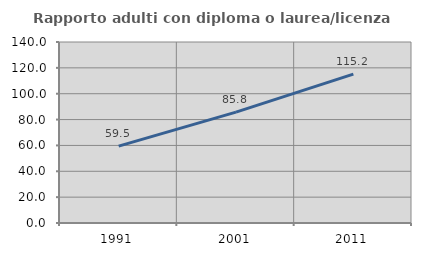
| Category | Rapporto adulti con diploma o laurea/licenza media  |
|---|---|
| 1991.0 | 59.496 |
| 2001.0 | 85.755 |
| 2011.0 | 115.187 |